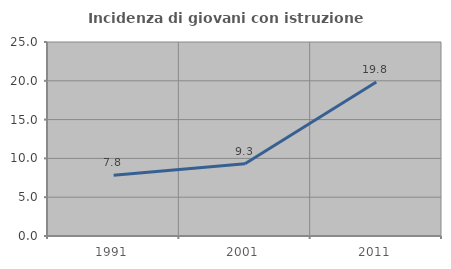
| Category | Incidenza di giovani con istruzione universitaria |
|---|---|
| 1991.0 | 7.828 |
| 2001.0 | 9.313 |
| 2011.0 | 19.847 |